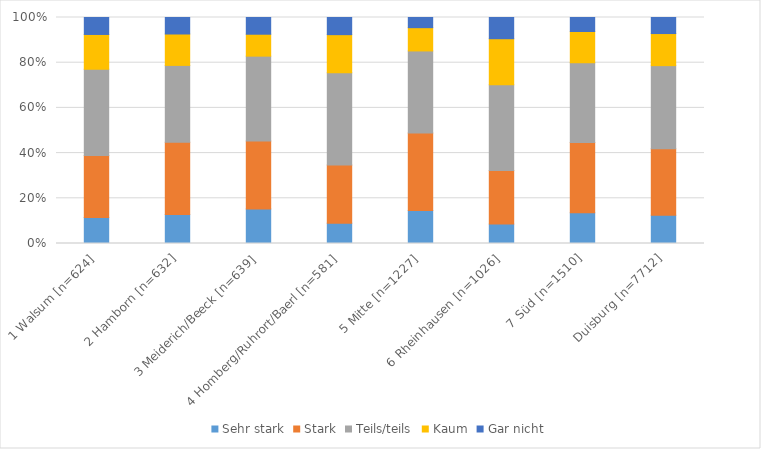
| Category | Sehr stark | Stark | Teils/teils | Kaum | Gar nicht |
|---|---|---|---|---|---|
| 1 Walsum [n=624] | 0.115 | 0.274 | 0.381 | 0.154 | 0.075 |
| 2 Hamborn [n=632] | 0.128 | 0.32 | 0.34 | 0.139 | 0.073 |
| 3 Meiderich/Beeck [n=639] | 0.153 | 0.3 | 0.376 | 0.097 | 0.074 |
| 4 Homberg/Ruhrort/Baerl [n=581] | 0.09 | 0.258 | 0.408 | 0.169 | 0.076 |
| 5 Mitte [n=1227] | 0.146 | 0.343 | 0.363 | 0.103 | 0.045 |
| 6 Rheinhausen [n=1026] | 0.086 | 0.237 | 0.38 | 0.204 | 0.094 |
| 7 Süd [n=1510] | 0.136 | 0.311 | 0.352 | 0.138 | 0.062 |
| Duisburg [n=7712] | 0.125 | 0.294 | 0.368 | 0.142 | 0.071 |